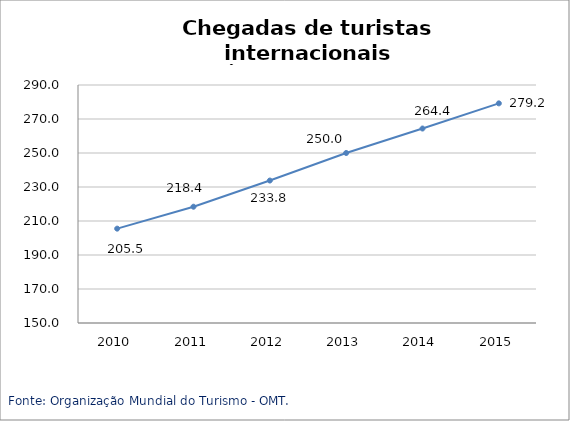
| Category | Ásia e Pacífico |
|---|---|
| 2010.0 | 205.5 |
| 2011.0 | 218.4 |
| 2012.0 | 233.8 |
| 2013.0 | 250 |
| 2014.0 | 264.4 |
| 2015.0 | 279.2 |